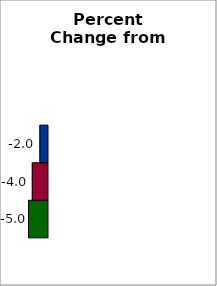
| Category | 50 states and D.C. | SREB states | State |
|---|---|---|---|
| 0 | -5 | -4 | -2 |